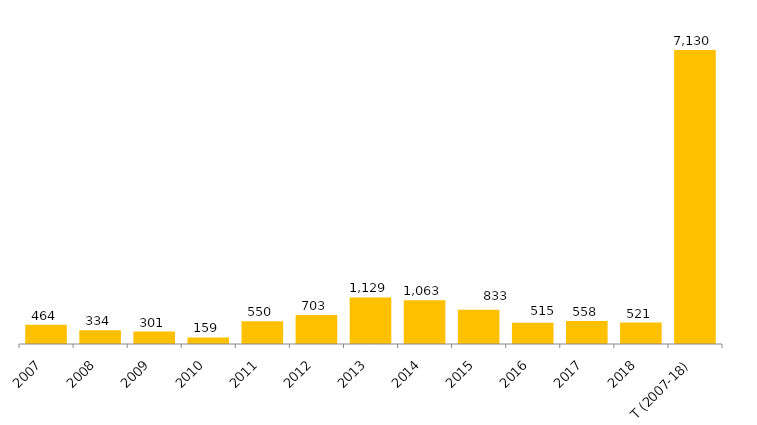
| Category | Total Geral |
|---|---|
| 2007 | 464 |
| 2008 | 334 |
| 2009 | 301 |
| 2010 | 159 |
| 2011 | 550 |
| 2012 | 703 |
| 2013 | 1129 |
| 2014 | 1063 |
| 2015 | 833 |
| 2016 | 515 |
| 2017 | 558 |
| 2018 | 521 |
| T (2007-18) | 7130 |